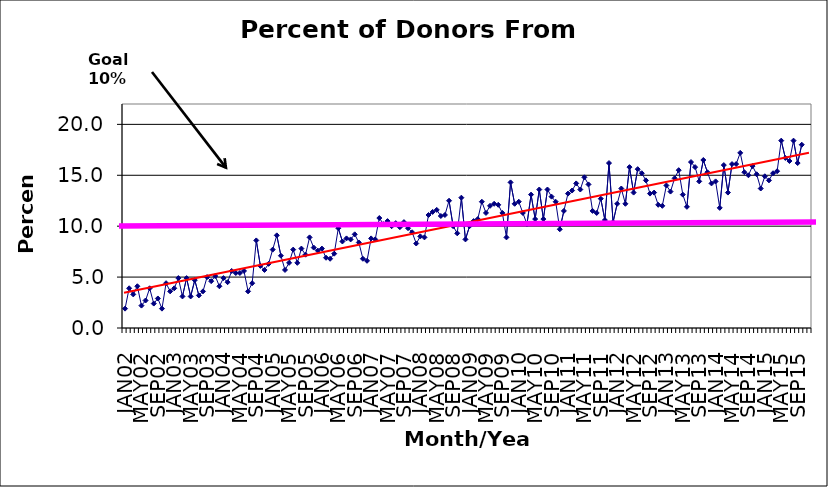
| Category | Series 0 |
|---|---|
| JAN02 | 1.9 |
| FEB02 | 3.9 |
| MAR02 | 3.3 |
| APR02 | 4.1 |
| MAY02 | 2.2 |
| JUN02 | 2.7 |
| JUL02 | 3.9 |
| AUG02 | 2.4 |
| SEP02 | 2.9 |
| OCT02 | 1.9 |
| NOV02 | 4.4 |
| DEC02 | 3.6 |
| JAN03 | 3.9 |
| FEB03 | 4.9 |
| MAR03 | 3.1 |
| APR03 | 4.9 |
| MAY03 | 3.1 |
| JUN03 | 4.7 |
| JUL03 | 3.2 |
| AUG03 | 3.6 |
| SEP03 | 5 |
| OCT03 | 4.6 |
| NOV03 | 5.1 |
| DEC03 | 4.1 |
| JAN04 | 4.9 |
| FEB04 | 4.5 |
| MAR04 | 5.6 |
| APR04 | 5.4 |
| MAY04 | 5.4 |
| JUN04 | 5.6 |
| JUL04 | 3.6 |
| AUG04 | 4.4 |
| SEP04 | 8.6 |
| OCT04 | 6.1 |
| NOV04 | 5.7 |
| DEC04 | 6.3 |
| JAN05 | 7.7 |
| FEB05 | 9.1 |
| MAR05 | 7.1 |
| APR05 | 5.7 |
| MAY05 | 6.4 |
| JUN05 | 7.7 |
| JUL05 | 6.4 |
| AUG05 | 7.8 |
| SEP05 | 7.2 |
| OCT05 | 8.9 |
| NOV05 | 7.9 |
| DEC05 | 7.6 |
| JAN06 | 7.8 |
| FEB06 | 6.9 |
| MAR06 | 6.8 |
| APR06 | 7.3 |
| MAY06 | 9.8 |
| JUN06 | 8.5 |
| JUL06 | 8.8 |
| AUG06 | 8.7 |
| SEP06 | 9.2 |
| OCT06 | 8.4 |
| NOV06 | 6.8 |
| DEC06 | 6.6 |
| JAN07 | 8.8 |
| FEB07 | 8.7 |
| MAR07 | 10.8 |
| APR07 | 10.2 |
| MAY07 | 10.5 |
| JUN07 | 10 |
| JUL07 | 10.3 |
| AUG07 | 9.9 |
| SEP07 | 10.4 |
| OCT07 | 9.8 |
| NOV07 | 9.4 |
| DEC07 | 8.3 |
| JAN08 | 9 |
| FEB08 | 8.9 |
| MAR08 | 11.1 |
| APR08 | 11.4 |
| MAY08 | 11.6 |
| JUN08 | 11 |
| JUL08 | 11.1 |
| AUG08 | 12.5 |
| SEP08 | 10 |
| OCT08 | 9.3 |
| NOV08 | 12.8 |
| DEC08 | 8.7 |
| JAN09 | 10 |
| FEB09 | 10.5 |
| MAR09 | 10.7 |
| APR09 | 12.4 |
| MAY09 | 11.3 |
| JUN09 | 12 |
| JUL09 | 12.2 |
| AUG09 | 12.1 |
| SEP09 | 11.3 |
| OCT09 | 8.9 |
| NOV09 | 14.3 |
| DEC09 | 12.2 |
| JAN10 | 12.4 |
| FEB10 | 11.3 |
| MAR10 | 10.2 |
| APR10 | 13.1 |
| MAY10 | 10.7 |
| JUN10 | 13.6 |
| JUL10 | 10.7 |
| AUG10 | 13.6 |
| SEP10 | 12.9 |
| OCT10 | 12.4 |
| NOV10 | 9.7 |
| DEC10 | 11.5 |
| JAN11 | 13.2 |
| FEB11 | 13.5 |
| MAR11 | 14.2 |
| APR11 | 13.6 |
| MAY11 | 14.8 |
| JUN11 | 14.1 |
| JUL11 | 11.5 |
| AUG11 | 11.3 |
| SEP11 | 12.7 |
| OCT11 | 10.6 |
| NOV11 | 16.2 |
| DEC11 | 10.4 |
| JAN12 | 12.2 |
| FEB12 | 13.7 |
| MAR12 | 12.2 |
| APR12 | 15.8 |
| MAY12 | 13.3 |
| JUN12 | 15.6 |
| JUL12 | 15.2 |
| AUG12 | 14.5 |
| SEP12 | 13.2 |
| OCT12 | 13.3 |
| NOV12 | 12.1 |
| DEC12 | 12 |
| JAN13 | 14 |
| FEB13 | 13.4 |
| MAR13 | 14.7 |
| APR13 | 15.5 |
| MAY13 | 13.1 |
| JUN13 | 11.9 |
| JUL13 | 16.3 |
| AUG13 | 15.8 |
| SEP13 | 14.4 |
| OCT13 | 16.5 |
| NOV13 | 15.3 |
| DEC13 | 14.2 |
| JAN14 | 14.4 |
| FEB14 | 11.8 |
| MAR14 | 16 |
| APR14 | 13.3 |
| MAY14 | 16.1 |
| JUN14 | 16.1 |
| JUL14 | 17.2 |
| AUG14 | 15.3 |
| SEP14 | 15 |
| OCT14 | 15.9 |
| NOV14 | 15.1 |
| DEC14 | 13.7 |
| JAN15 | 14.9 |
| FEB15 | 14.5 |
| MAR15 | 15.2 |
| APR15 | 15.4 |
| MAY15 | 18.4 |
| JUN15 | 16.7 |
| JUL15 | 16.4 |
| AUG15 | 18.4 |
| SEP15 | 16.2 |
| OCT15 | 18 |